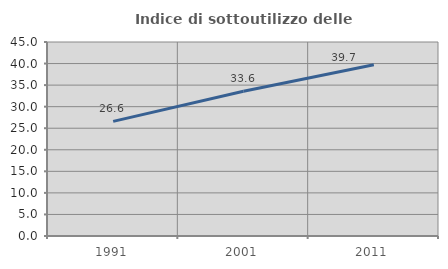
| Category | Indice di sottoutilizzo delle abitazioni  |
|---|---|
| 1991.0 | 26.582 |
| 2001.0 | 33.582 |
| 2011.0 | 39.706 |